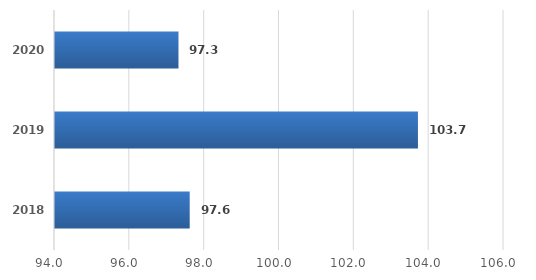
| Category | Series 0 |
|---|---|
| 2018.0 | 97.6 |
| 2019.0 | 103.7 |
| 2020.0 | 97.3 |